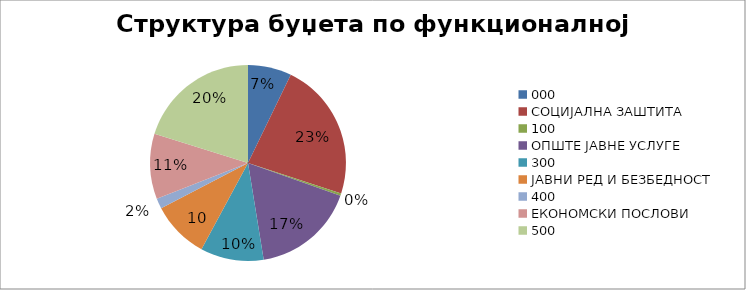
| Category | Series 0 |
|---|---|
| 0 | 58710000 |
| 1 | 186300000 |
| 2 | 3100000 |
| 3 | 139000000 |
| 4 | 85150000 |
| 5 | 77230000 |
| 6 | 14000000 |
| 7 | 87860000 |
| 8 | 164650000 |